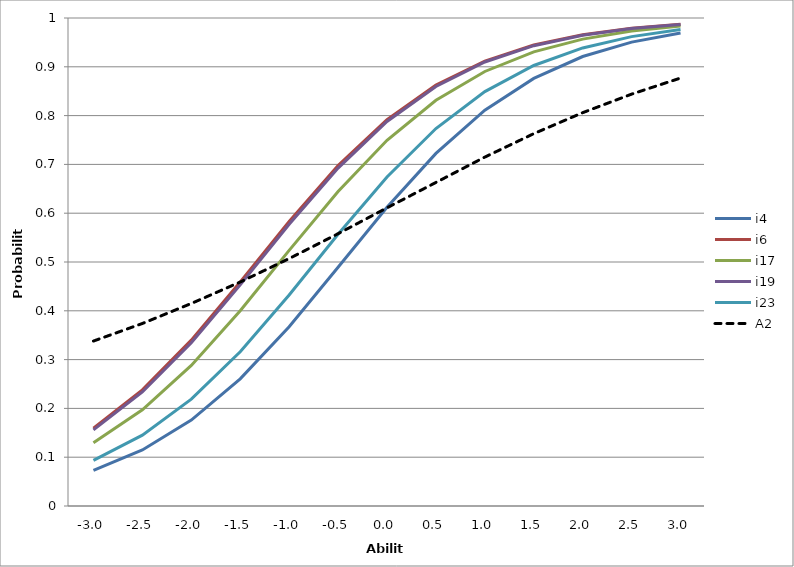
| Category | i4 | i6 | i17 | i19 | i23 | A2 |
|---|---|---|---|---|---|---|
| -3.0 | 0.073 | 0.159 | 0.13 | 0.156 | 0.093 | 0.338 |
| -2.5 | 0.115 | 0.238 | 0.197 | 0.234 | 0.145 | 0.374 |
| -2.0 | 0.176 | 0.34 | 0.288 | 0.334 | 0.219 | 0.415 |
| -1.5 | 0.261 | 0.459 | 0.4 | 0.453 | 0.316 | 0.459 |
| -1.0 | 0.367 | 0.583 | 0.524 | 0.577 | 0.432 | 0.507 |
| -0.5 | 0.489 | 0.698 | 0.645 | 0.693 | 0.557 | 0.558 |
| 0.0 | 0.612 | 0.792 | 0.749 | 0.788 | 0.674 | 0.611 |
| 0.5 | 0.723 | 0.862 | 0.831 | 0.86 | 0.773 | 0.663 |
| 1.0 | 0.811 | 0.912 | 0.89 | 0.91 | 0.849 | 0.715 |
| 1.5 | 0.876 | 0.945 | 0.931 | 0.943 | 0.903 | 0.763 |
| 2.0 | 0.921 | 0.966 | 0.957 | 0.965 | 0.939 | 0.806 |
| 2.5 | 0.951 | 0.979 | 0.973 | 0.978 | 0.962 | 0.844 |
| 3.0 | 0.969 | 0.987 | 0.984 | 0.987 | 0.977 | 0.877 |